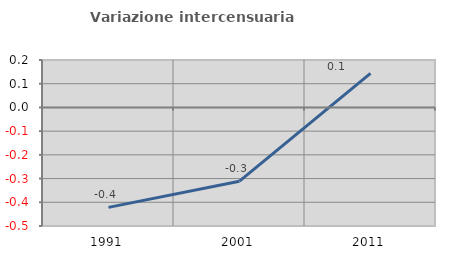
| Category | Variazione intercensuaria annua |
|---|---|
| 1991.0 | -0.421 |
| 2001.0 | -0.311 |
| 2011.0 | 0.144 |